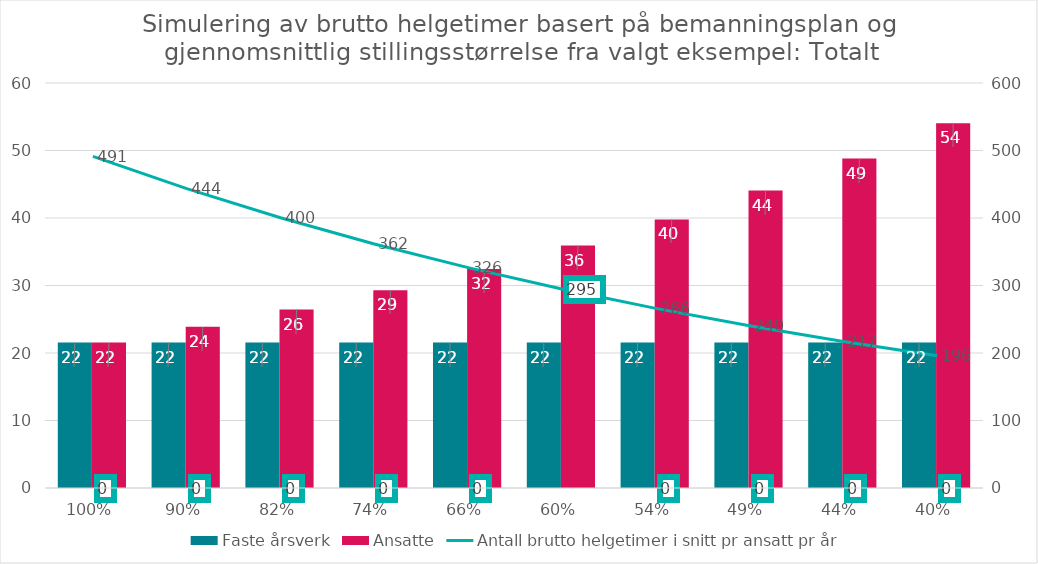
| Category | Faste årsverk | Ansatte |
|---|---|---|
| 1.0 | 21.552 | 21.552 |
| 0.9028804514474342 | 21.552 | 23.87 |
| 0.8151931096059225 | 21.552 | 26.438 |
| 0.7360219228178331 | 21.552 | 29.282 |
| 0.6645398059489738 | 21.552 | 32.432 |
| 0.5999999999999998 | 21.552 | 35.92 |
| 0.5417282708684603 | 21.552 | 39.784 |
| 0.4891158657635533 | 21.552 | 44.063 |
| 0.44161315369069964 | 21.552 | 48.803 |
| 0.39872388356938404 | 21.552 | 54.053 |